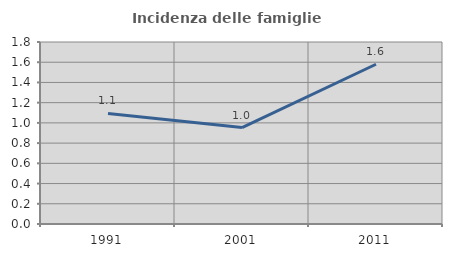
| Category | Incidenza delle famiglie numerose |
|---|---|
| 1991.0 | 1.094 |
| 2001.0 | 0.953 |
| 2011.0 | 1.58 |